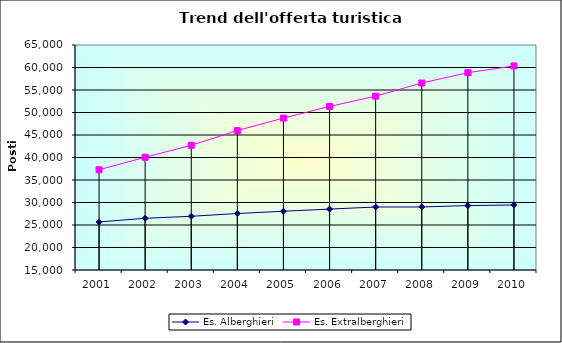
| Category | Es. Alberghieri | Es. Extralberghieri |
|---|---|---|
| 2001.0 | 25679 | 37274 |
| 2002.0 | 26493 | 40055 |
| 2003.0 | 26935 | 42722 |
| 2004.0 | 27555 | 45990 |
| 2005.0 | 28057 | 48755 |
| 2006.0 | 28538 | 51348 |
| 2007.0 | 28995 | 53630 |
| 2008.0 | 29012 | 56559 |
| 2009.0 | 29313 | 58849 |
| 2010.0 | 29455 | 60345 |